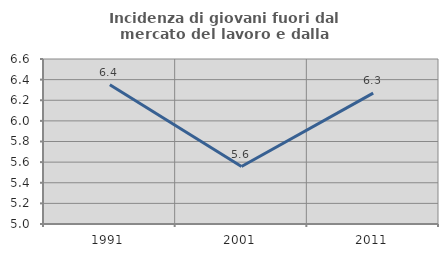
| Category | Incidenza di giovani fuori dal mercato del lavoro e dalla formazione  |
|---|---|
| 1991.0 | 6.351 |
| 2001.0 | 5.557 |
| 2011.0 | 6.269 |